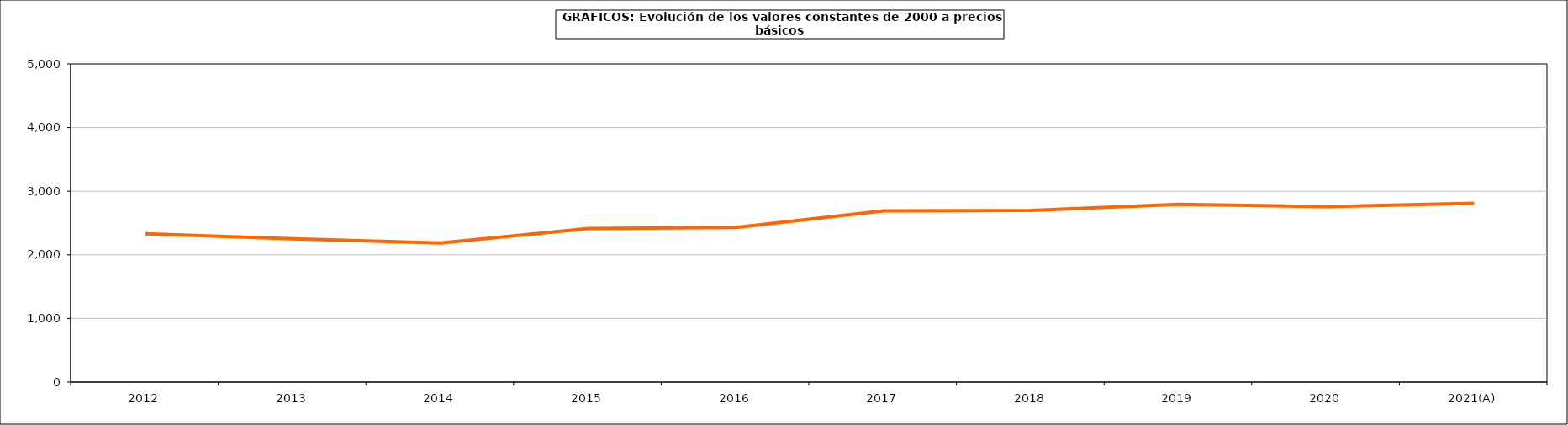
| Category | Formación bruta del capital fijo |
|---|---|
| 2012 | 2331.161 |
| 2013 | 2253.363 |
| 2014 | 2184.558 |
| 2015 | 2413.291 |
| 2016 | 2429.162 |
| 2017 | 2691.407 |
| 2018 | 2699.572 |
| 2019 | 2793.638 |
| 2020 | 2758.59 |
| 2021(A) | 2811.567 |